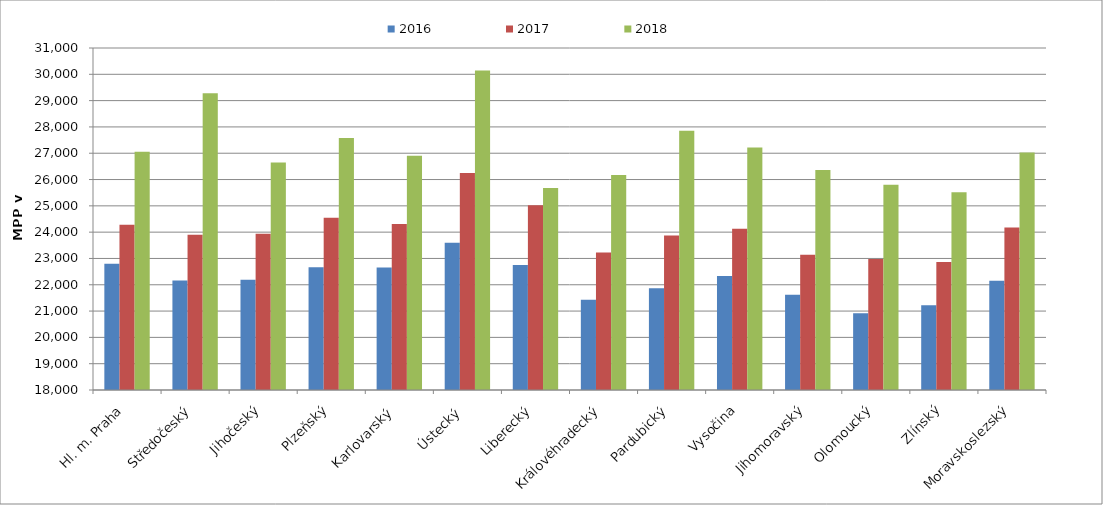
| Category | 2016 | 2017 | 2018 |
|---|---|---|---|
| Hl. m. Praha | 22795.104 | 24278.641 | 27055.516 |
| Středočeský | 22161.702 | 23903.813 | 29282.496 |
| Jihočeský | 22189.65 | 23940.674 | 26646.292 |
| Plzeňský | 22661.503 | 24550.117 | 27574.387 |
| Karlovarský  | 22652.563 | 24312.449 | 26899.919 |
| Ústecký   | 23598.351 | 26247.405 | 30140.911 |
| Liberecký | 22750.586 | 25024.905 | 25677.101 |
| Královéhradecký | 21428.702 | 23228.768 | 26169.549 |
| Pardubický | 21865.723 | 23870.283 | 27850.245 |
| Vysočina | 22337.696 | 24124.868 | 27213.397 |
| Jihomoravský | 21616.192 | 23143.116 | 26366.415 |
| Olomoucký | 20920.874 | 22975.632 | 25801.379 |
| Zlínský | 21217.725 | 22867.509 | 25515.146 |
| Moravskoslezský | 22156.654 | 24175.115 | 27023.041 |